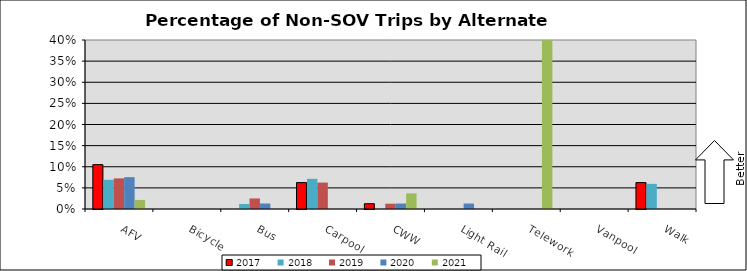
| Category | 2017 | 2018 | 2019 | 2020 | 2021 |
|---|---|---|---|---|---|
| AFV | 0.105 | 0.069 | 0.072 | 0.075 | 0.021 |
| Bicycle | 0 | 0 | 0 | 0 | 0 |
| Bus | 0 | 0.012 | 0.025 | 0.013 | 0 |
| Carpool | 0.062 | 0.071 | 0.062 | 0 | 0 |
| CWW | 0.012 | 0 | 0.012 | 0.013 | 0.037 |
| Light Rail | 0 | 0 | 0 | 0.013 | 0 |
| Telework | 0 | 0 | 0 | 0 | 0.537 |
| Vanpool | 0 | 0 | 0 | 0 | 0 |
| Walk | 0.062 | 0.06 | 0 | 0 | 0 |